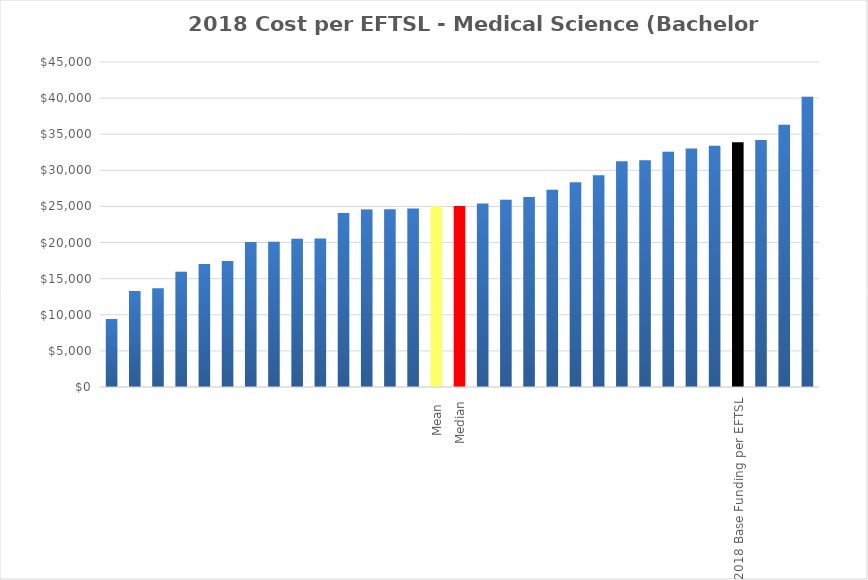
| Category | Series 0 |
|---|---|
|  | 9401.613 |
|  | 13281.099 |
|  | 13659.634 |
|  | 15948.828 |
|  | 17015.955 |
|  | 17460.772 |
|  | 20074.591 |
|  | 20103.67 |
|  | 20523.548 |
|  | 20568.297 |
|  | 24089.842 |
|  | 24574.511 |
|  | 24627.302 |
|  | 24724.295 |
| Mean  | 25036.13 |
| Median | 25071.82 |
|  | 25419.337 |
|  | 25914.278 |
|  | 26301.776 |
|  | 27328.29 |
|  | 28351.357 |
|  | 29319.798 |
|  | 31240.703 |
|  | 31381.429 |
|  | 32586.724 |
|  | 33031.152 |
|  | 33403.903 |
| 2018 Base Funding per EFTSL | 33905 |